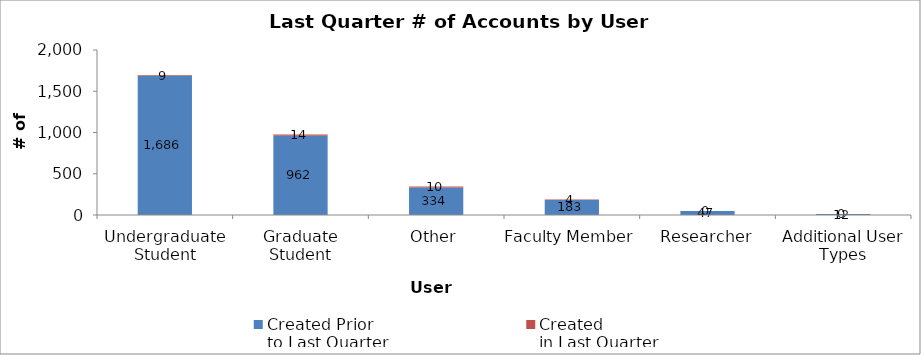
| Category | Created Prior _x000d_to Last Quarter | Created _x000d_in Last Quarter |
|---|---|---|
| Undergraduate Student | 1686 | 9 |
| Graduate Student | 962 | 14 |
| Other | 334 | 10 |
| Faculty Member | 183 | 4 |
| Researcher | 47 | 0 |
| Additional User Types | 12 | 0 |